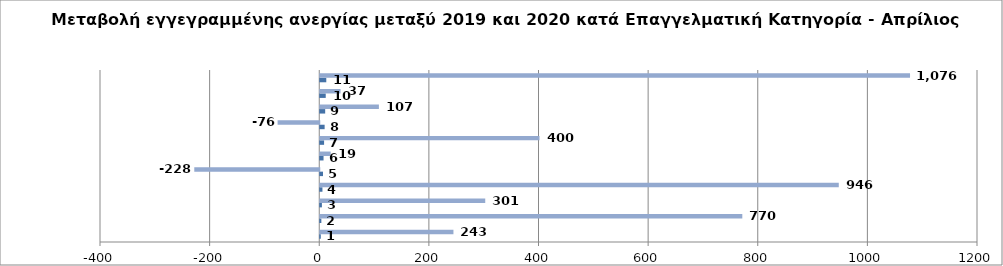
| Category | Series 0 | Series 1 |
|---|---|---|
| 0 | 1 | 243 |
| 1 | 2 | 770 |
| 2 | 3 | 301 |
| 3 | 4 | 946 |
| 4 | 5 | -228 |
| 5 | 6 | 19 |
| 6 | 7 | 400 |
| 7 | 8 | -76 |
| 8 | 9 | 107 |
| 9 | 10 | 37 |
| 10 | 11 | 1076 |